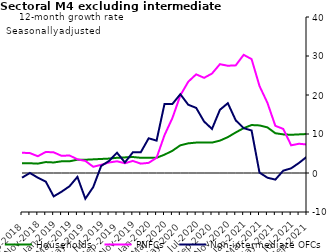
| Category | zero | Households | PNFCs | Non-intermediate OFCs |
|---|---|---|---|---|
| Sep-2018 | 0 | 2.5 | 5.2 | -1.2 |
| Oct-2018 | 0 | 2.5 | 5.1 | 0 |
| Nov-2018 | 0 | 2.4 | 4.3 | -1.2 |
| Dec-2018 | 0 | 2.8 | 5.4 | -2.2 |
| Jan-2019 | 0 | 2.7 | 5.3 | -6 |
| Feb-2019 | 0 | 3 | 4.4 | -4.8 |
| Mar-2019 | 0 | 3 | 4.5 | -3.4 |
| Apr-2019 | 0 | 3.4 | 3.5 | -1 |
| May-2019 | 0 | 3.4 | 3.1 | -6.6 |
| Jun-2019 | 0 | 3.5 | 1.6 | -3.6 |
| Jul-2019 | 0 | 3.6 | 2.1 | 1.8 |
| Aug-2019 | 0 | 3.7 | 2.7 | 3.1 |
| Sep-2019 | 0 | 3.9 | 3 | 5.2 |
| Oct-2019 | 0 | 4 | 2.5 | 2.7 |
| Nov-2019 | 0 | 4.1 | 3.1 | 5.3 |
| Dec-2019 | 0 | 3.9 | 2.4 | 5.3 |
| Jan-2020 | 0 | 3.9 | 2.6 | 8.9 |
| Feb-2020 | 0 | 3.9 | 3.9 | 8.3 |
| Mar-2020 | 0 | 4.7 | 9.7 | 17.7 |
| Apr-2020 | 0 | 5.7 | 14.1 | 17.7 |
| May-2020 | 0 | 7.1 | 19.9 | 20.2 |
| Jun-2020 | 0 | 7.6 | 23.4 | 17.5 |
| Jul-2020 | 0 | 7.8 | 25.3 | 16.7 |
| Aug-2020 | 0 | 7.8 | 24.4 | 13.2 |
| Sep-2020 | 0 | 7.8 | 25.5 | 11.3 |
| Oct-2020 | 0 | 8.3 | 27.9 | 16.2 |
| Nov-2020 | 0 | 9.2 | 27.5 | 17.9 |
| Dec-2020 | 0 | 10.4 | 27.6 | 13.5 |
| Jan-2021 | 0 | 11.5 | 30.3 | 11.5 |
| Feb-2021 | 0 | 12.3 | 29.2 | 10.9 |
| Mar-2021 | 0 | 12.2 | 22.3 | 0.1 |
| Apr-2021 | 0 | 11.7 | 18 | -1.2 |
| May-2021 | 0 | 10.2 | 12.1 | -1.7 |
| Jun-2021 | 0 | 9.9 | 11.3 | 0.6 |
| Jul-2021 | 0 | 9.8 | 7.1 | 1.2 |
| Aug-2021 | 0 | 9.9 | 7.5 | 2.6 |
| Sep-2021 | 0 | 10 | 7.3 | 4.2 |